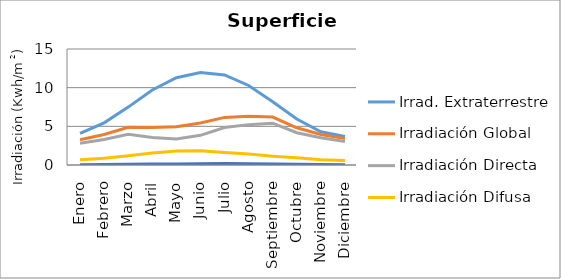
| Category | Irrad. Extraterrestre | Irradiación Global | Irradiación Directa | Irradiación Difusa | Irradiación Reflejada |
|---|---|---|---|---|---|
| Enero | 4.099 | 3.269 | 2.802 | 0.669 | 0.047 |
| Febrero | 5.457 | 3.937 | 3.287 | 0.885 | 0.066 |
| Marzo | 7.483 | 4.884 | 3.97 | 1.188 | 0.098 |
| Abril | 9.7 | 4.858 | 3.545 | 1.564 | 0.12 |
| Mayo | 11.288 | 4.94 | 3.36 | 1.815 | 0.142 |
| Junio | 11.966 | 5.433 | 3.836 | 1.843 | 0.168 |
| Julio | 11.647 | 6.156 | 4.84 | 1.601 | 0.185 |
| Agosto | 10.284 | 6.32 | 5.22 | 1.419 | 0.163 |
| Septiembre | 8.19 | 6.202 | 5.408 | 1.137 | 0.129 |
| Octubre | 5.94 | 4.817 | 4.178 | 0.925 | 0.082 |
| Noviembre | 4.3 | 3.955 | 3.516 | 0.685 | 0.056 |
| Diciembre | 3.675 | 3.41 | 3.031 | 0.594 | 0.045 |